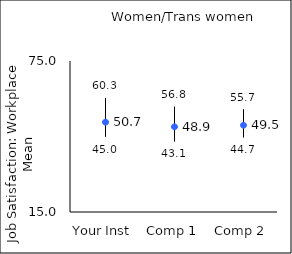
| Category | 25th percentile | 75th percentile | Mean |
|---|---|---|---|
| Your Inst | 45 | 60.3 | 50.7 |
| Comp 1 | 43.1 | 56.8 | 48.85 |
| Comp 2 | 44.7 | 55.7 | 49.47 |